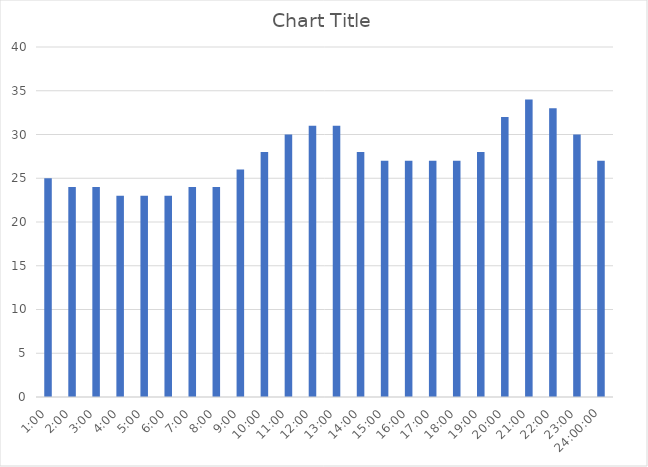
| Category | Series 0 |
|---|---|
| 0.041666666666666664 | 25 |
| 0.08333333333333333 | 24 |
| 0.125 | 24 |
| 0.16666666666666666 | 23 |
| 0.20833333333333334 | 23 |
| 0.25 | 23 |
| 0.2916666666666667 | 24 |
| 0.3333333333333333 | 24 |
| 0.375 | 26 |
| 0.4166666666666667 | 28 |
| 0.4583333333333333 | 30 |
| 0.5 | 31 |
| 0.5416666666666666 | 31 |
| 0.5833333333333334 | 28 |
| 0.625 | 27 |
| 0.6666666666666666 | 27 |
| 0.7083333333333334 | 27 |
| 0.75 | 27 |
| 0.7916666666666666 | 28 |
| 0.8333333333333334 | 32 |
| 0.875 | 34 |
| 0.9166666666666666 | 33 |
| 0.9583333333333334 | 30 |
| 1900-01-01 | 27 |